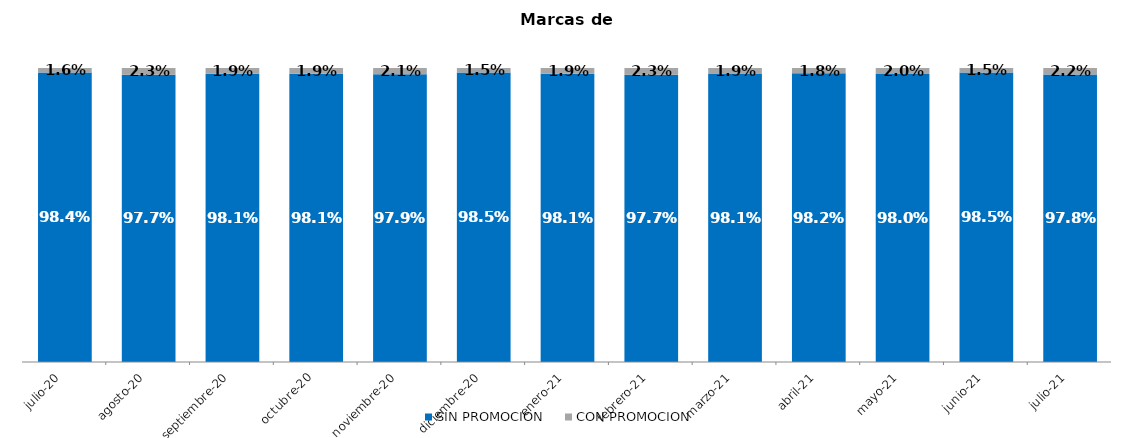
| Category | SIN PROMOCION   | CON PROMOCION   |
|---|---|---|
| 2020-07-01 | 0.984 | 0.016 |
| 2020-08-01 | 0.977 | 0.023 |
| 2020-09-01 | 0.981 | 0.019 |
| 2020-10-01 | 0.981 | 0.019 |
| 2020-11-01 | 0.979 | 0.021 |
| 2020-12-01 | 0.985 | 0.015 |
| 2021-01-01 | 0.981 | 0.019 |
| 2021-02-01 | 0.977 | 0.023 |
| 2021-03-01 | 0.981 | 0.019 |
| 2021-04-01 | 0.982 | 0.018 |
| 2021-05-01 | 0.98 | 0.02 |
| 2021-06-01 | 0.985 | 0.015 |
| 2021-07-01 | 0.978 | 0.022 |